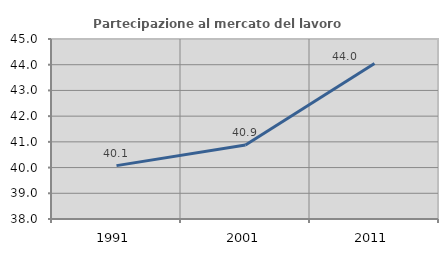
| Category | Partecipazione al mercato del lavoro  femminile |
|---|---|
| 1991.0 | 40.076 |
| 2001.0 | 40.879 |
| 2011.0 | 44.043 |